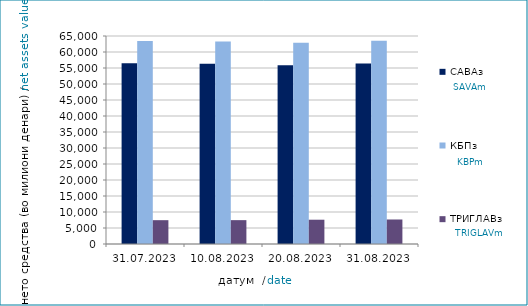
| Category | САВАз | КБПз | ТРИГЛАВз |
|---|---|---|---|
| 2023-07-31 | 56489.14 | 63429.931 | 7445.032 |
| 2023-08-10 | 56300.287 | 63289.267 | 7455.488 |
| 2023-08-20 | 55884.021 | 62905.62 | 7587.027 |
| 2023-08-31 | 56441.354 | 63523.103 | 7659.292 |